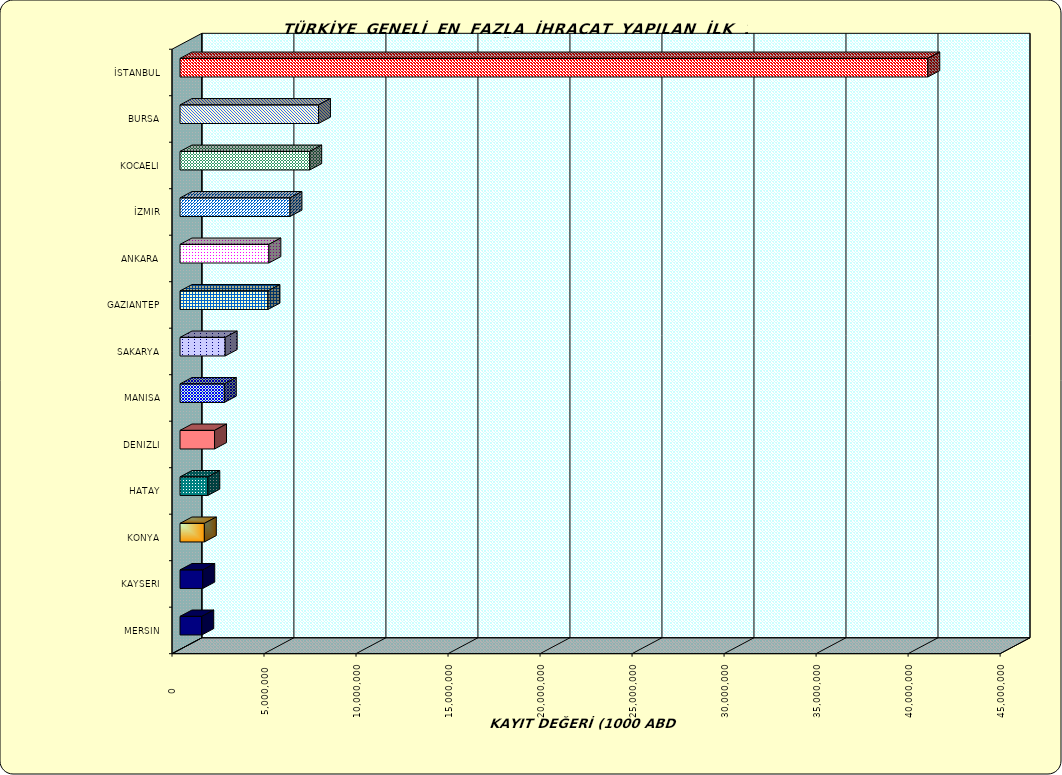
| Category | Series 0 |
|---|---|
| İSTANBUL | 40635036.699 |
| BURSA | 7524911.023 |
| KOCAELI | 7048111.474 |
| İZMIR | 5976065.695 |
| ANKARA | 4828353.687 |
| GAZIANTEP | 4779106.483 |
| SAKARYA | 2454699.058 |
| MANISA | 2409069.468 |
| DENIZLI | 1876529.987 |
| HATAY | 1510326.259 |
| KONYA | 1323084.603 |
| KAYSERI | 1236664.24 |
| MERSIN | 1181970.343 |